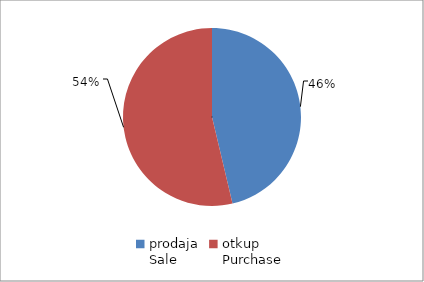
| Category | Series 0 |
|---|---|
| prodaja
Sale | 11513221.671 |
| otkup
Purchase | 13354378.26 |